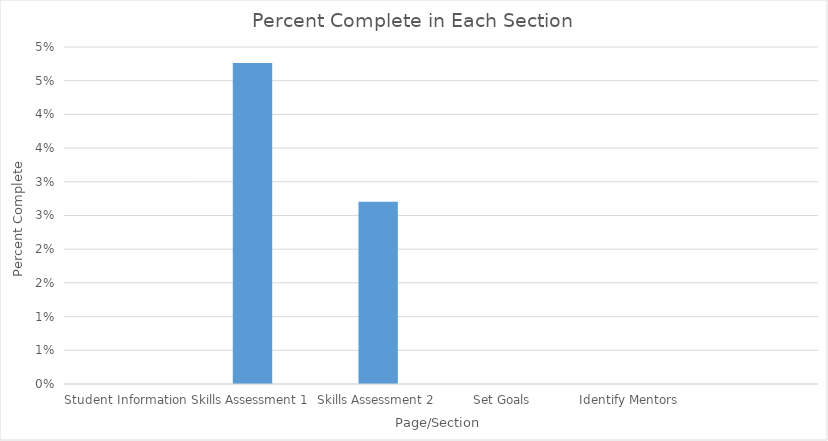
| Category | Series 0 |
|---|---|
| Student Information | 0 |
| Skills Assessment 1 | 0.048 |
| Skills Assessment 2 | 0.027 |
| Set Goals | 0 |
| Identify Mentors | 0 |